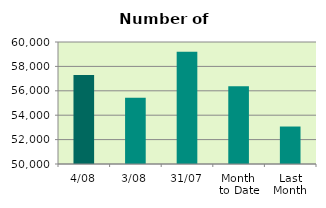
| Category | Series 0 |
|---|---|
| 4/08 | 57302 |
| 3/08 | 55432 |
| 31/07 | 59194 |
| Month 
to Date | 56367 |
| Last
Month | 53071.913 |